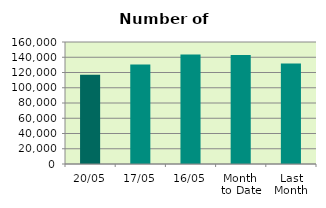
| Category | Series 0 |
|---|---|
| 20/05 | 117196 |
| 17/05 | 130378 |
| 16/05 | 143710 |
| Month 
to Date | 143016.923 |
| Last
Month | 131708.5 |